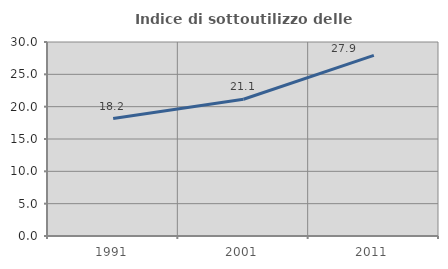
| Category | Indice di sottoutilizzo delle abitazioni  |
|---|---|
| 1991.0 | 18.162 |
| 2001.0 | 21.148 |
| 2011.0 | 27.927 |